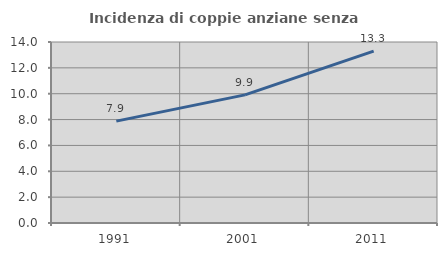
| Category | Incidenza di coppie anziane senza figli  |
|---|---|
| 1991.0 | 7.88 |
| 2001.0 | 9.91 |
| 2011.0 | 13.296 |